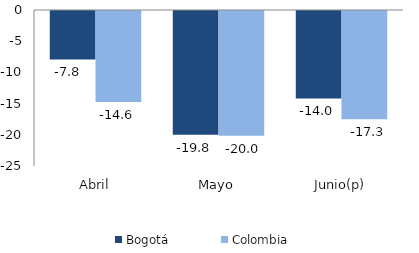
| Category | Bogotá | Colombia |
|---|---|---|
| Abril | -7.76 | -14.602 |
| Mayo | -19.84 | -19.974 |
| Junio(p) | -14.02 | -17.332 |